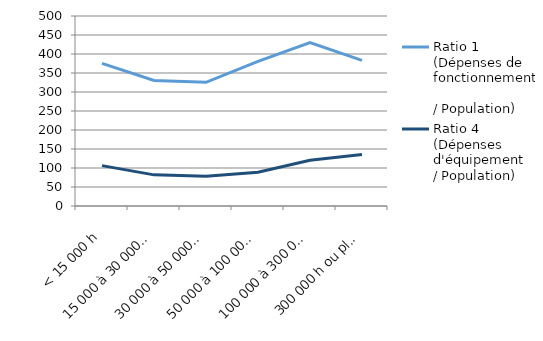
| Category | Ratio 1 
(Dépenses de fonctionnement 
/ Population) | Ratio 4 
(Dépenses d'équipement 
/ Population) |
|---|---|---|
| < 15 000 h | 375.402 | 106.281 |
| 15 000 à 30 000 h | 330.269 | 81.944 |
| 30 000 à 50 000 h | 325.4 | 78.54 |
| 50 000 à 100 000 h | 380.824 | 88.769 |
| 100 000 à 300 000 h | 430.216 | 120.225 |
| 300 000 h ou plus | 383.3 | 135.687 |